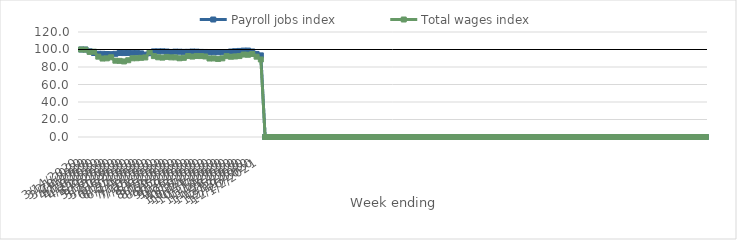
| Category | Payroll jobs index | Total wages index |
|---|---|---|
| 14/03/2020 | 100 | 100 |
| 21/03/2020 | 99.956 | 99.824 |
| 28/03/2020 | 97.891 | 97.229 |
| 04/04/2020 | 96.012 | 97.514 |
| 11/04/2020 | 95.109 | 91.81 |
| 18/04/2020 | 95.055 | 89.671 |
| 25/04/2020 | 94.85 | 89.883 |
| 02/05/2020 | 94.69 | 91.104 |
| 09/05/2020 | 95.084 | 87.202 |
| 16/05/2020 | 96.029 | 87 |
| 23/05/2020 | 95.917 | 86.35 |
| 30/05/2020 | 96.046 | 87.744 |
| 06/06/2020 | 96.275 | 89.938 |
| 13/06/2020 | 96.409 | 90.022 |
| 20/06/2020 | 95.582 | 90.493 |
| 27/06/2020 | 94.198 | 90.925 |
| 04/07/2020 | 95.742 | 97.13 |
| 11/07/2020 | 97.825 | 92.451 |
| 18/07/2020 | 97.83 | 91.094 |
| 25/07/2020 | 97.89 | 90.719 |
| 01/08/2020 | 97.662 | 91.55 |
| 08/08/2020 | 97.2 | 91.012 |
| 15/08/2020 | 97.537 | 90.963 |
| 22/08/2020 | 97.446 | 89.982 |
| 29/08/2020 | 97.272 | 90.5 |
| 05/09/2020 | 97.33 | 92.511 |
| 12/09/2020 | 97.635 | 91.903 |
| 19/09/2020 | 97.511 | 92.6 |
| 26/09/2020 | 97.24 | 92.488 |
| 03/10/2020 | 97.172 | 92.03 |
| 10/10/2020 | 96.679 | 89.699 |
| 17/10/2020 | 96.759 | 89.803 |
| 24/10/2020 | 96.828 | 89.211 |
| 31/10/2020 | 96.866 | 89.909 |
| 07/11/2020 | 96.912 | 92.406 |
| 14/11/2020 | 97.687 | 91.723 |
| 21/11/2020 | 98.053 | 92.05 |
| 28/11/2020 | 98.366 | 92.483 |
| 05/12/2020 | 98.746 | 94.24 |
| 12/12/2020 | 98.77 | 93.982 |
| 19/12/2020 | 97.75 | 94.883 |
| 26/12/2020 | 94.928 | 91.81 |
| 02/01/2021 | 93.273 | 88.617 |